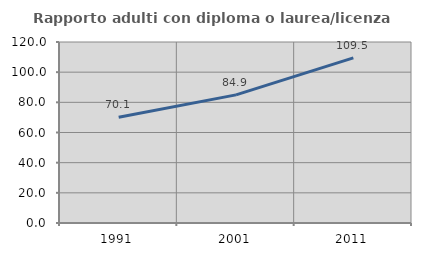
| Category | Rapporto adulti con diploma o laurea/licenza media  |
|---|---|
| 1991.0 | 70.068 |
| 2001.0 | 84.949 |
| 2011.0 | 109.502 |